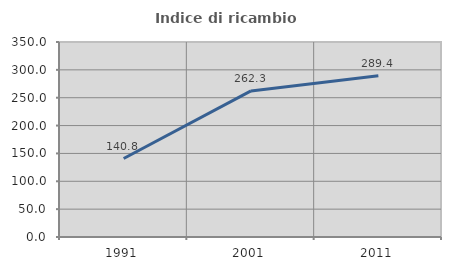
| Category | Indice di ricambio occupazionale  |
|---|---|
| 1991.0 | 140.812 |
| 2001.0 | 262.255 |
| 2011.0 | 289.412 |